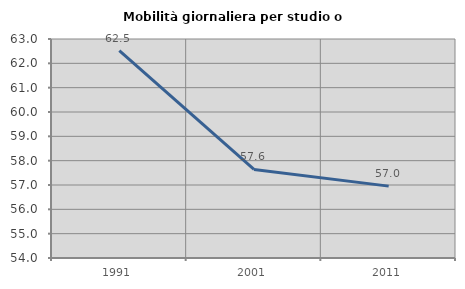
| Category | Mobilità giornaliera per studio o lavoro |
|---|---|
| 1991.0 | 62.52 |
| 2001.0 | 57.638 |
| 2011.0 | 56.954 |